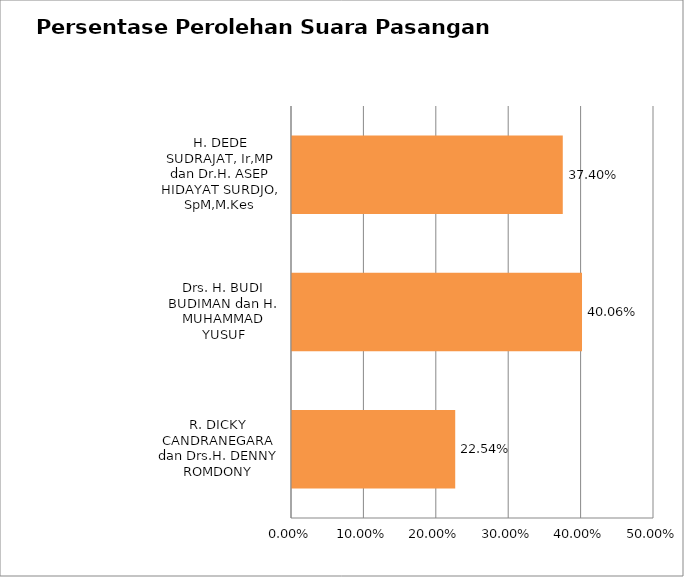
| Category | PERSENTASE |
|---|---|
| R. DICKY CANDRANEGARA dan Drs.H. DENNY ROMDONY | 0.225 |
| Drs. H. BUDI BUDIMAN dan H. MUHAMMAD YUSUF | 0.401 |
| H. DEDE SUDRAJAT, Ir,MP dan Dr.H. ASEP HIDAYAT SURDJO, SpM,M.Kes | 0.374 |